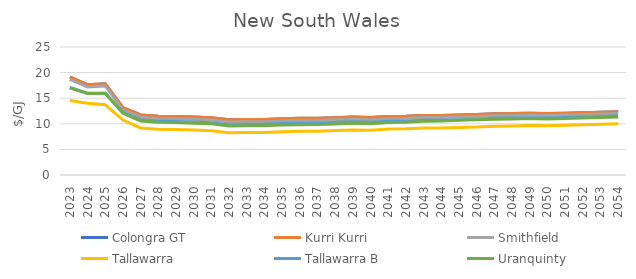
| Category | Colongra GT | Kurri Kurri | Smithfield | Tallawarra | Tallawarra B | Uranquinty |
|---|---|---|---|---|---|---|
| 2023.0 | 19.106 | 19.106 | 18.674 | 14.541 | 17.084 | 17.003 |
| 2024.0 | 17.645 | 17.645 | 17.215 | 14.002 | 15.979 | 15.904 |
| 2025.0 | 17.83 | 17.83 | 17.402 | 13.723 | 15.987 | 15.951 |
| 2026.0 | 13.163 | 13.163 | 12.737 | 10.737 | 12.237 | 12.071 |
| 2027.0 | 11.728 | 11.728 | 11.283 | 9.183 | 10.758 | 10.554 |
| 2028.0 | 11.492 | 11.492 | 11.049 | 8.949 | 10.524 | 10.295 |
| 2029.0 | 11.439 | 11.439 | 10.999 | 8.899 | 10.474 | 10.263 |
| 2030.0 | 11.309 | 11.309 | 10.871 | 8.771 | 10.346 | 10.131 |
| 2031.0 | 11.174 | 11.174 | 10.738 | 8.638 | 10.213 | 9.992 |
| 2032.0 | 10.774 | 10.774 | 10.34 | 8.24 | 9.815 | 9.577 |
| 2033.0 | 10.816 | 10.816 | 10.384 | 8.284 | 9.859 | 9.601 |
| 2034.0 | 10.848 | 10.848 | 10.418 | 8.318 | 9.893 | 9.639 |
| 2035.0 | 10.992 | 10.992 | 10.564 | 8.464 | 10.039 | 9.752 |
| 2036.0 | 11.066 | 11.066 | 10.64 | 8.54 | 10.115 | 9.828 |
| 2037.0 | 11.088 | 11.088 | 10.665 | 8.565 | 10.14 | 9.848 |
| 2038.0 | 11.2 | 11.2 | 10.778 | 8.678 | 10.253 | 9.961 |
| 2039.0 | 11.327 | 11.327 | 10.908 | 8.808 | 10.383 | 10.111 |
| 2040.0 | 11.215 | 11.215 | 10.807 | 8.757 | 10.295 | 10.034 |
| 2041.0 | 11.416 | 11.416 | 11.01 | 8.96 | 10.498 | 10.25 |
| 2042.0 | 11.473 | 11.473 | 11.07 | 9.02 | 10.557 | 10.324 |
| 2043.0 | 11.626 | 11.626 | 11.225 | 9.175 | 10.712 | 10.501 |
| 2044.0 | 11.623 | 11.623 | 11.223 | 9.173 | 10.711 | 10.555 |
| 2045.0 | 11.718 | 11.718 | 11.32 | 9.27 | 10.808 | 10.671 |
| 2046.0 | 11.805 | 11.805 | 11.409 | 9.359 | 10.897 | 10.767 |
| 2047.0 | 11.969 | 11.969 | 11.583 | 9.533 | 11.071 | 10.906 |
| 2048.0 | 12.018 | 12.018 | 11.642 | 9.592 | 11.129 | 10.932 |
| 2049.0 | 12.076 | 12.076 | 11.708 | 9.658 | 11.196 | 11.026 |
| 2050.0 | 11.99 | 11.99 | 11.635 | 9.616 | 11.131 | 10.96 |
| 2051.0 | 12.082 | 12.082 | 11.734 | 9.715 | 11.23 | 11.057 |
| 2052.0 | 12.175 | 12.175 | 11.834 | 9.816 | 11.331 | 11.154 |
| 2053.0 | 12.269 | 12.269 | 11.934 | 9.917 | 11.432 | 11.251 |
| 2054.0 | 12.363 | 12.363 | 12.035 | 10.02 | 11.535 | 11.35 |